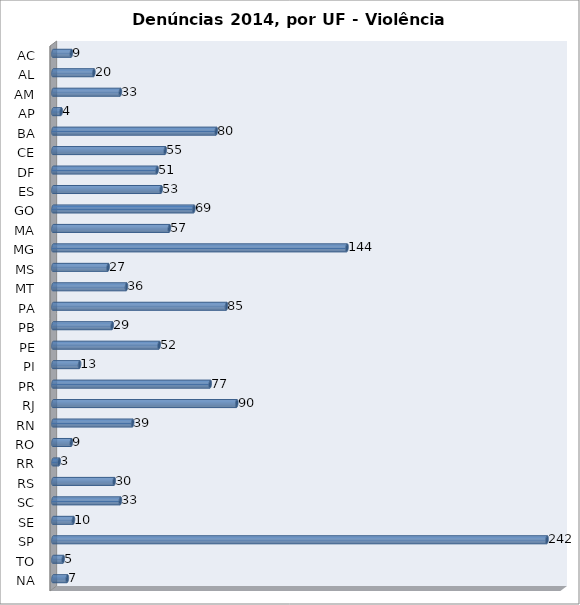
| Category | Series 0 |
|---|---|
| AC | 9 |
| AL | 20 |
| AM | 33 |
| AP | 4 |
| BA | 80 |
| CE | 55 |
| DF | 51 |
| ES | 53 |
| GO | 69 |
| MA | 57 |
| MG | 144 |
| MS | 27 |
| MT | 36 |
| PA | 85 |
| PB | 29 |
| PE | 52 |
| PI | 13 |
| PR | 77 |
| RJ | 90 |
| RN | 39 |
| RO | 9 |
| RR | 3 |
| RS | 30 |
| SC | 33 |
| SE | 10 |
| SP | 242 |
| TO | 5 |
| NA | 7 |